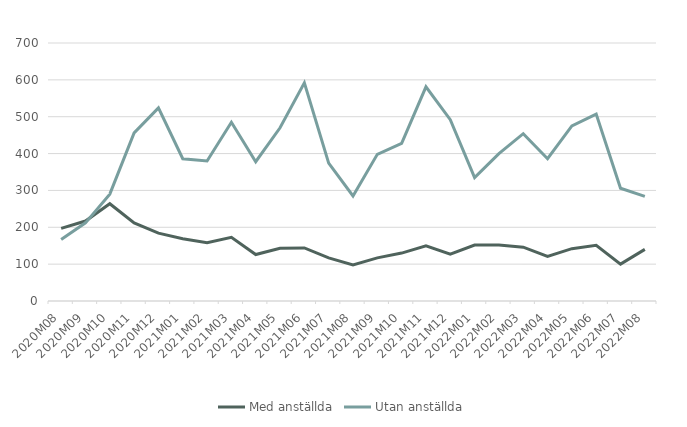
| Category | Med anställda | Utan anställda |
|---|---|---|
| 2020M08 | 197 | 167 |
| 2020M09 | 217 | 212 |
| 2020M10 | 264 | 290 |
| 2020M11 | 212 | 456 |
| 2020M12 | 184 | 524 |
| 2021M01 | 169 | 386 |
| 2021M02 | 158 | 380 |
| 2021M03 | 173 | 485 |
| 2021M04 | 126 | 378 |
| 2021M05 | 143 | 470 |
| 2021M06 | 144 | 592 |
| 2021M07 | 117 | 374 |
| 2021M08 | 98 | 285 |
| 2021M09 | 117 | 398 |
| 2021M10 | 130 | 428 |
| 2021M11 | 150 | 581 |
| 2021M12 | 127 | 492 |
| 2022M01 | 152 | 335 |
| 2022M02 | 152 | 400 |
| 2022M03 | 146 | 454 |
| 2022M04 | 121 | 386 |
| 2022M05 | 142 | 475 |
| 2022M06 | 151 | 507 |
| 2022M07 | 100 | 306 |
| 2022M08 | 140 | 284 |